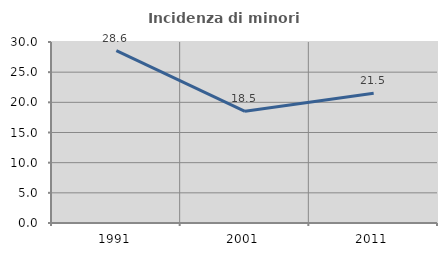
| Category | Incidenza di minori stranieri |
|---|---|
| 1991.0 | 28.571 |
| 2001.0 | 18.519 |
| 2011.0 | 21.505 |